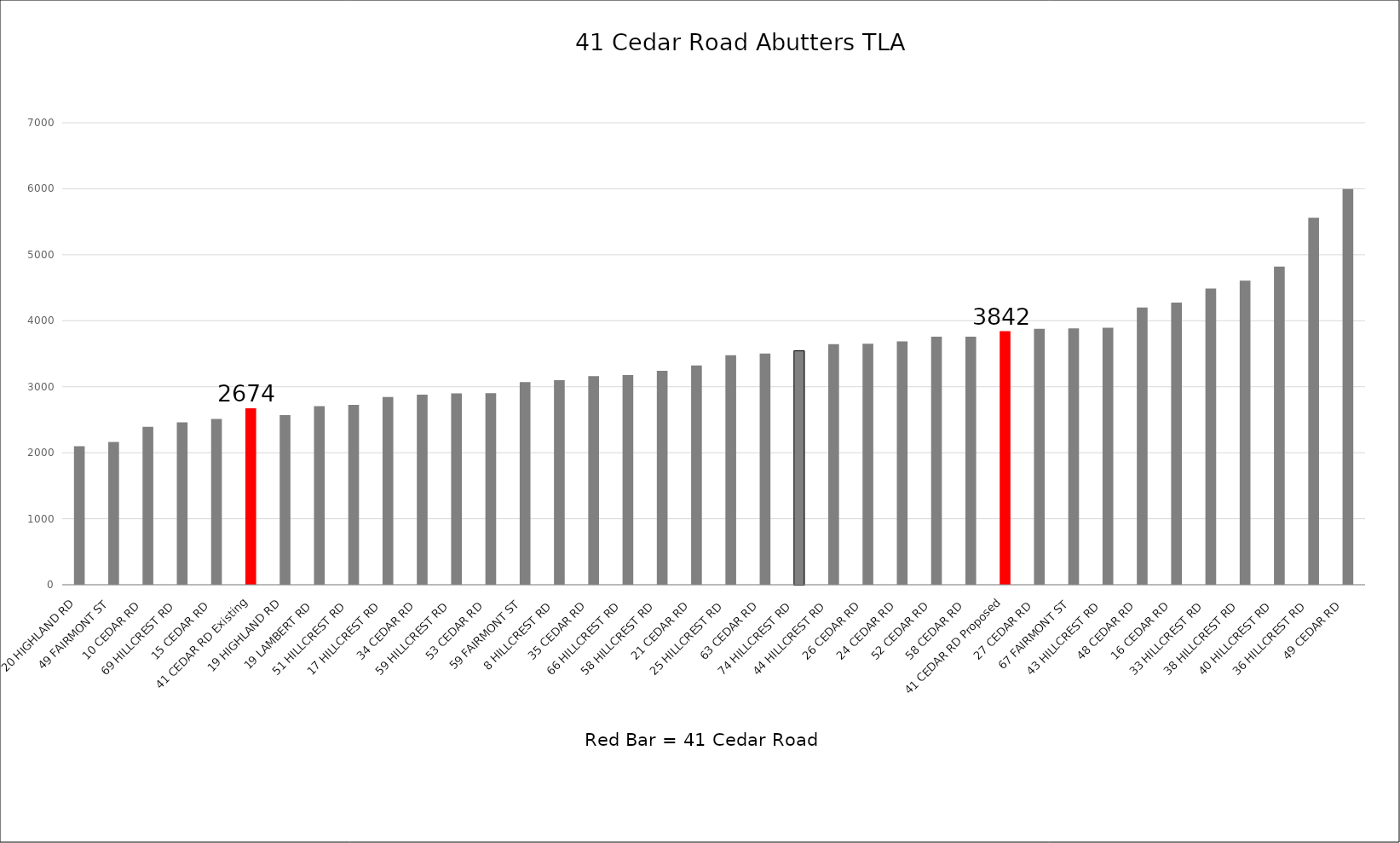
| Category | TLA |
|---|---|
| 20 HIGHLAND RD  | 2099 |
| 49 FAIRMONT ST  | 2164 |
| 10 CEDAR RD  | 2392 |
| 69 HILLCREST RD  | 2460 |
| 15 CEDAR RD  | 2512 |
| 41 CEDAR RD Existing | 2674 |
| 19 HIGHLAND RD  | 2570 |
| 19 LAMBERT RD  | 2706 |
| 51 HILLCREST RD  | 2724 |
| 17 HILLCREST RD  | 2844 |
| 34 CEDAR RD  | 2880 |
| 59 HILLCREST RD  | 2901 |
| 53 CEDAR RD  | 2904 |
| 59 FAIRMONT ST  | 3072 |
| 8 HILLCREST RD  | 3100 |
| 35 CEDAR RD  | 3160 |
| 66 HILLCREST RD  | 3178 |
| 58 HILLCREST RD  | 3243 |
| 21 CEDAR RD  | 3323 |
| 25 HILLCREST RD  | 3477 |
| 63 CEDAR RD  | 3504 |
| 74 HILLCREST RD  | 3544 |
| 44 HILLCREST RD  | 3645 |
| 26 CEDAR RD  | 3651 |
| 24 CEDAR RD  | 3686 |
| 52 CEDAR RD  | 3757 |
| 58 CEDAR RD  | 3758 |
| 41 CEDAR RD Proposed | 3842 |
| 27 CEDAR RD  | 3879 |
| 67 FAIRMONT ST  | 3884 |
| 43 HILLCREST RD  | 3895 |
| 48 CEDAR RD  | 4200 |
| 16 CEDAR RD  | 4274 |
| 33 HILLCREST RD  | 4488 |
| 38 HILLCREST RD  | 4607 |
| 40 HILLCREST RD  | 4821 |
| 36 HILLCREST RD  | 5559 |
| 49 CEDAR RD  | 5995 |